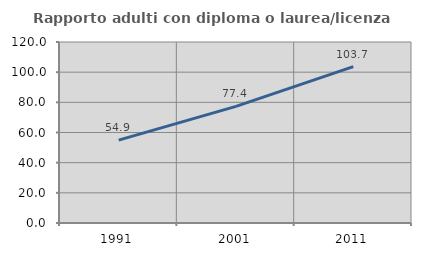
| Category | Rapporto adulti con diploma o laurea/licenza media  |
|---|---|
| 1991.0 | 54.935 |
| 2001.0 | 77.354 |
| 2011.0 | 103.654 |